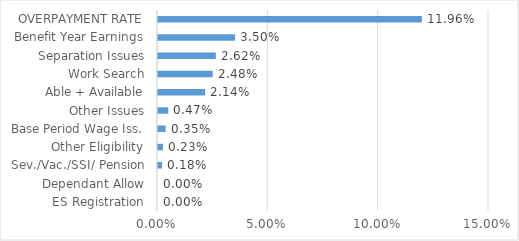
| Category | Series 0 |
|---|---|
| ES Registration | 0 |
| Dependant Allow | 0 |
| Sev./Vac./SSI/ Pension | 0.002 |
| Other Eligibility | 0.002 |
| Base Period Wage Iss. | 0.003 |
| Other Issues | 0.005 |
| Able + Available | 0.021 |
| Work Search | 0.025 |
| Separation Issues | 0.026 |
| Benefit Year Earnings | 0.035 |
| OVERPAYMENT RATE | 0.12 |